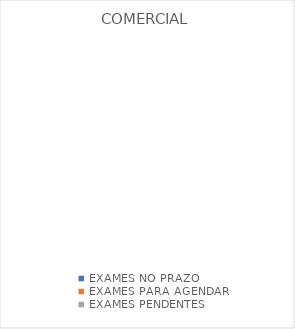
| Category | COMERCIAL |
|---|---|
| EXAMES NO PRAZO | 0 |
| EXAMES PARA AGENDAR | 0 |
| EXAMES PENDENTES | 0 |